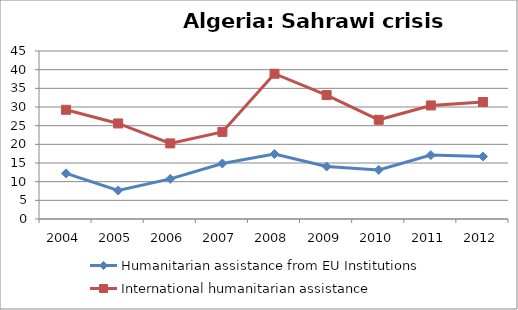
| Category | Humanitarian assistance from EU Institutions | International humanitarian assistance |
|---|---|---|
| 2004.0 | 12.22 | 29.258 |
| 2005.0 | 7.64 | 25.592 |
| 2006.0 | 10.75 | 20.249 |
| 2007.0 | 14.87 | 23.336 |
| 2008.0 | 17.41 | 38.91 |
| 2009.0 | 14.06 | 33.19 |
| 2010.0 | 13.14 | 26.573 |
| 2011.0 | 17.11 | 30.417 |
| 2012.0 | 16.73 | 31.343 |